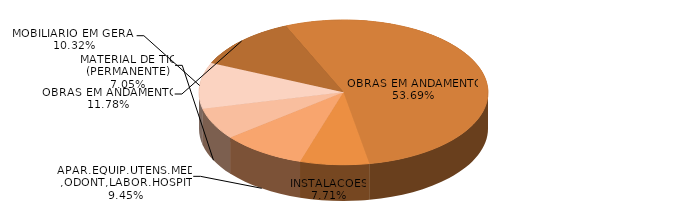
| Category | Series 0 | Series 1 |
|---|---|---|
| OBRAS EM ANDAMENTO | 270623.01 | 0.105 |
| OBRAS EM ANDAMENTO | 1233797.67 | 0.478 |
| INSTALACOES | 177206.48 | 0.069 |
| APAR.EQUIP.UTENS.MED.,ODONT,LABOR.HOSPIT. | 217252.59 | 0.084 |
| MATERIAL DE TIC (PERMANENTE) | 161903.97 | 0.063 |
| MOBILIARIO EM GERAL | 237256.3 | 0.092 |